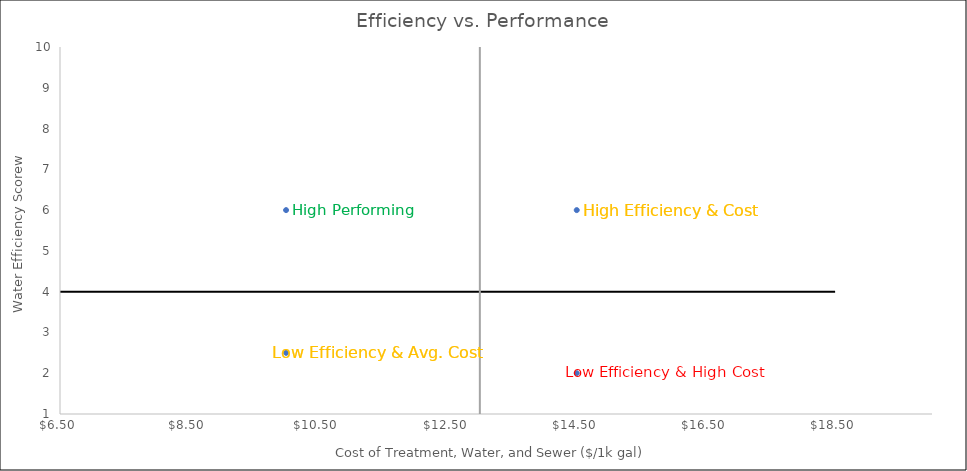
| Category | Series 0 |
|---|---|
| 10.0 | 6 |
| 14.5 | 6 |
| 10.0 | 2.5 |
| 14.5 | 2 |
| 0.0 | 0 |